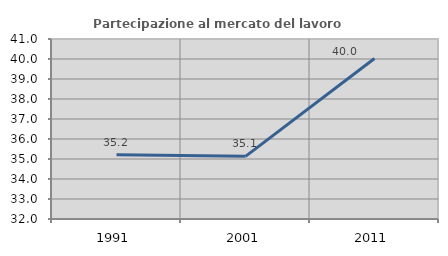
| Category | Partecipazione al mercato del lavoro  femminile |
|---|---|
| 1991.0 | 35.211 |
| 2001.0 | 35.132 |
| 2011.0 | 40.028 |